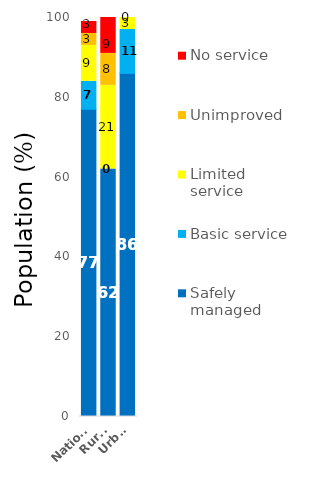
| Category | Safely managed | Basic service | Limited service | Unimproved | No service |
|---|---|---|---|---|---|
| National | 77 | 7 | 9 | 3 | 3 |
| Rural | 62 | 0 | 21 | 8 | 9 |
| Urban | 86 | 11 | 3 | 0 | 0 |